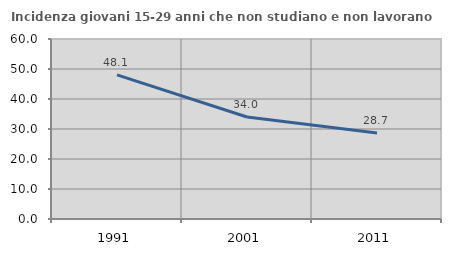
| Category | Incidenza giovani 15-29 anni che non studiano e non lavorano  |
|---|---|
| 1991.0 | 48.052 |
| 2001.0 | 33.995 |
| 2011.0 | 28.693 |